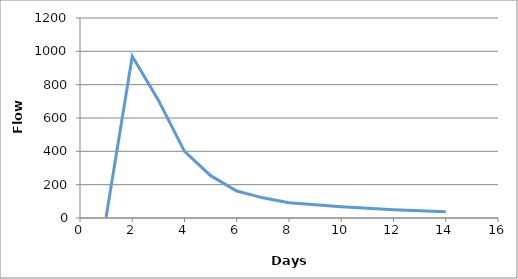
| Category | Series 0 |
|---|---|
| 1.0 | 6 |
| 2.0 | 970 |
| 3.0 | 707 |
| 4.0 | 400 |
| 5.0 | 254 |
| 6.0 | 162 |
| 7.0 | 121 |
| 8.0 | 91 |
| 9.0 | 79 |
| 10.0 | 68 |
| 11.0 | 58 |
| 12.0 | 50 |
| 13.0 | 43 |
| 14.0 | 37 |